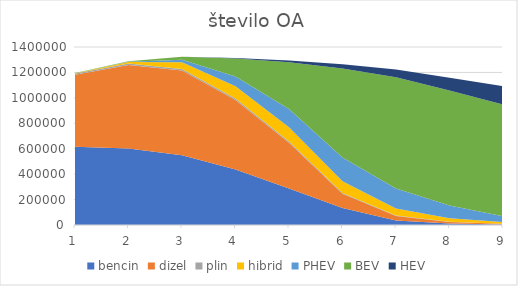
| Category | bencin | dizel | plin | hibrid | PHEV | BEV | HEV |
|---|---|---|---|---|---|---|---|
| 0 | 614980 | 565830 | 10530 | 2754 | 312 | 755 | 0 |
| 1 | 601235 | 658034 | 11649 | 11387 | 1658 | 3243 | 0 |
| 2 | 548145 | 667120 | 11799 | 53694 | 19758 | 21923 | 0 |
| 3 | 437152 | 545563 | 11605 | 97925 | 76040 | 140639 | 3792 |
| 4 | 286710 | 359982 | 10009 | 112670 | 143286 | 366566 | 13822 |
| 5 | 134267 | 110738 | 6580 | 93005 | 186379 | 700694 | 33033 |
| 6 | 36196 | 34314 | 3486 | 55938 | 157674 | 874990 | 59900 |
| 7 | 11240 | 13118 | 1832 | 26902 | 99495 | 905280 | 99777 |
| 8 | 4184 | 5268 | 1025 | 12073 | 47329 | 877254 | 145658 |